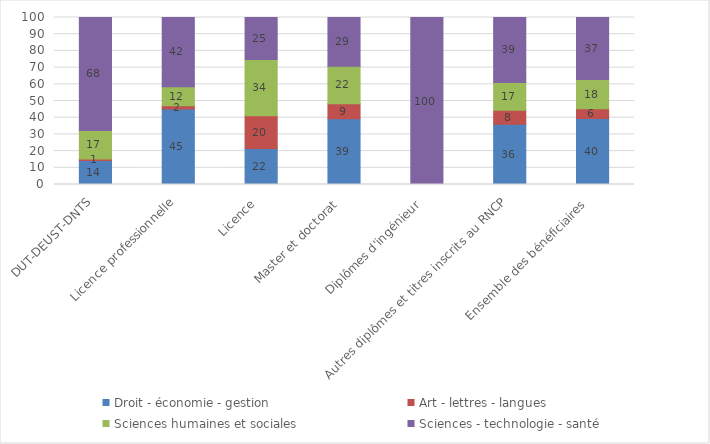
| Category | Droit - économie - gestion | Art - lettres - langues | Sciences humaines et sociales | Sciences - technologie - santé |
|---|---|---|---|---|
| DUT-DEUST-DNTS | 14.3 | 1 | 17.1 | 67.6 |
| Licence professionnelle | 45.2 | 1.9 | 11.5 | 41.5 |
| Licence  | 21.6 | 19.6 | 33.7 | 25.1 |
| Master et doctorat  | 39.4 | 9 | 22.4 | 29.3 |
| Diplômes d'ingénieur  | 0 | 0 | 0 | 100 |
| Autres diplômes et titres inscrits au RNCP | 36.1 | 8.3 | 16.7 | 38.9 |
| Ensemble des bénéficiaires  | 39.5 | 5.9 | 17.5 | 37.2 |